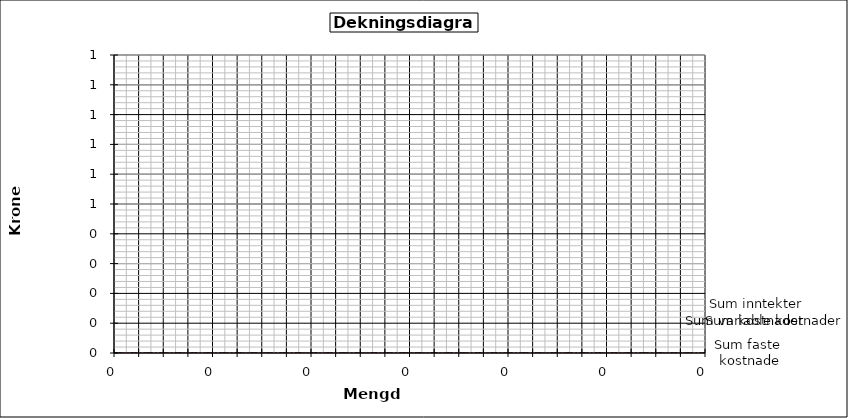
| Category | SI | VK | FK | TK |
|---|---|---|---|---|
| 0.0 | 0 | 0 | 0 | 0 |
| 0.0 | 0 | 0 | 0 | 0 |
| 0.0 | 0 | 0 | 0 | 0 |
| 0.0 | 0 | 0 | 0 | 0 |
| 0.0 | 0 | 0 | 0 | 0 |
| 0.0 | 0 | 0 | 0 | 0 |
| 0.0 | 0 | 0 | 0 | 0 |
| 0.0 | 0 | 0 | 0 | 0 |
| 0.0 | 0 | 0 | 0 | 0 |
| 0.0 | 0 | 0 | 0 | 0 |
| 0.0 | 0 | 0 | 0 | 0 |
| 0.0 | 0 | 0 | 0 | 0 |
| 0.0 | 0 | 0 | 0 | 0 |
| 0.0 | 0 | 0 | 0 | 0 |
| 0.0 | 0 | 0 | 0 | 0 |
| 0.0 | 0 | 0 | 0 | 0 |
| 0.0 | 0 | 0 | 0 | 0 |
| 0.0 | 0 | 0 | 0 | 0 |
| 0.0 | 0 | 0 | 0 | 0 |
| 0.0 | 0 | 0 | 0 | 0 |
| 0.0 | 0 | 0 | 0 | 0 |
| 0.0 | 0 | 0 | 0 | 0 |
| 0.0 | 0 | 0 | 0 | 0 |
| 0.0 | 0 | 0 | 0 | 0 |
| 0.0 | 0 | 0 | 0 | 0 |